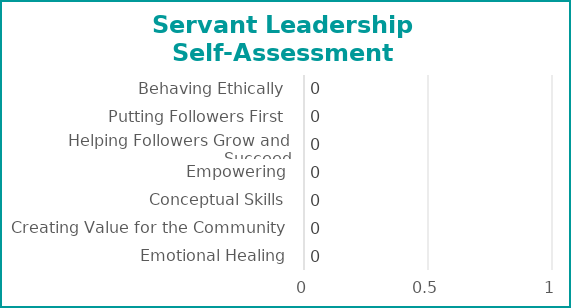
| Category | Series 0 |
|---|---|
| Emotional Healing | 0 |
| Creating Value for the Community | 0 |
| Conceptual Skills | 0 |
| Empowering | 0 |
| Helping Followers Grow and Succeed | 0 |
| Putting Followers First | 0 |
| Behaving Ethically | 0 |